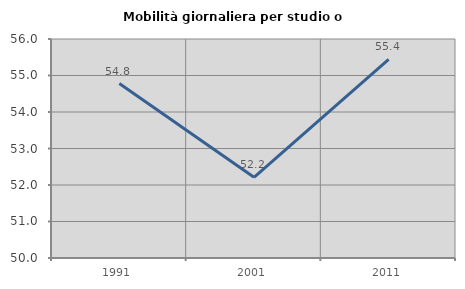
| Category | Mobilità giornaliera per studio o lavoro |
|---|---|
| 1991.0 | 54.78 |
| 2001.0 | 52.211 |
| 2011.0 | 55.444 |